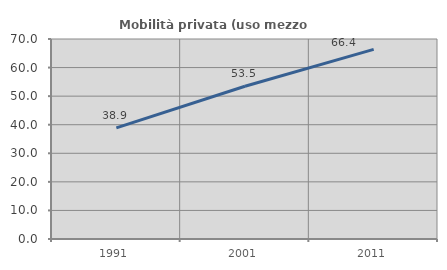
| Category | Mobilità privata (uso mezzo privato) |
|---|---|
| 1991.0 | 38.881 |
| 2001.0 | 53.451 |
| 2011.0 | 66.368 |